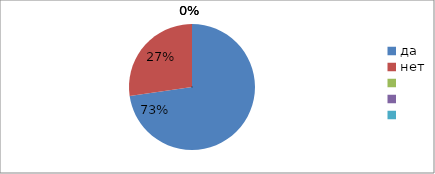
| Category | Series 0 | Series 1 |
|---|---|---|
| да | 72.7 | 72.7 |
| нет | 27.3 | 27.3 |